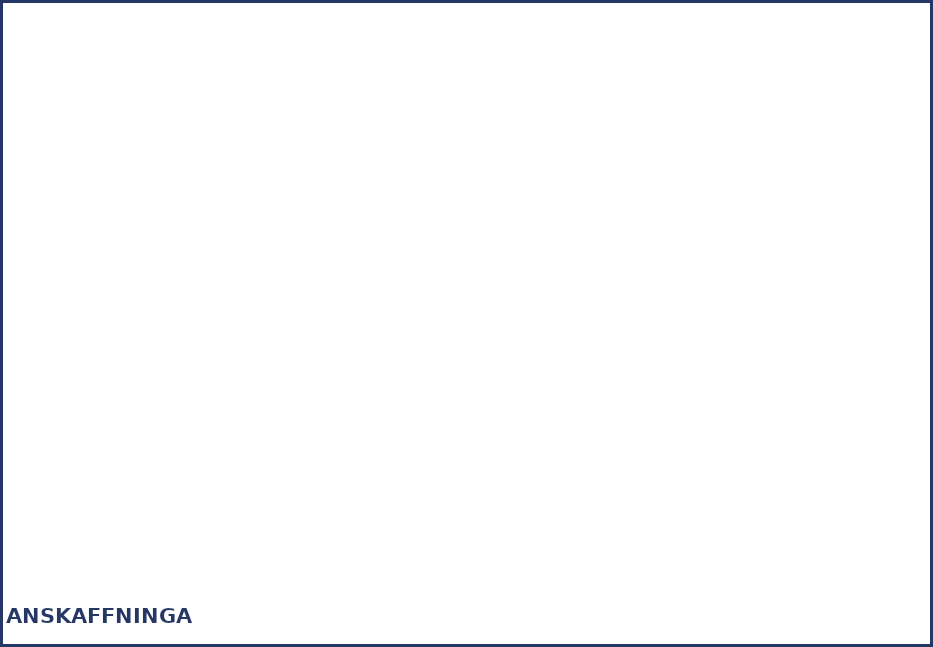
| Category | Series 0 |
|---|---|
| Scouthalsdukar/kläder/tyger | 0 |
| Scoutmärken och förtjänsttecken | 0 |
| Tält och utfärdsutrustning | 0 |
| Pyssel- och kontorsmaterial | 0 |
| Böcker, tidningar och broschyrer | 0 |
| Glas, kärl och köksredskap | 0 |
| Hushållsapparater och verktyg | 0 |
| Möbler | 0 |
| Trävaror och järnvaruhandelsvaror | 0 |
| Första hjälpen-utrustning | 0 |
| Elektronik och datorer | 0 |
| Palvelut | 0 |
| Övriga anskaffningar | 0 |